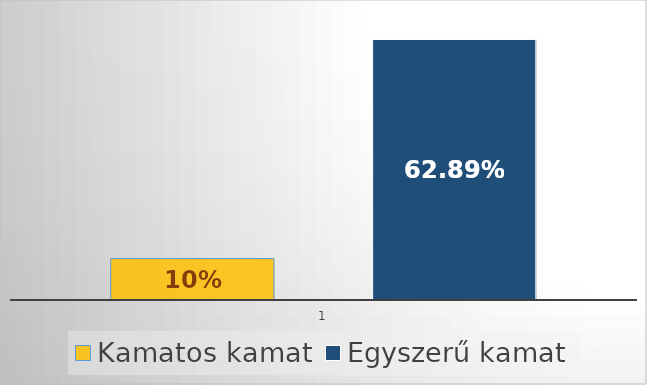
| Category | Kamatos kamat | Egyszerű kamat |
|---|---|---|
| 0 | 0.1 | 0.629 |